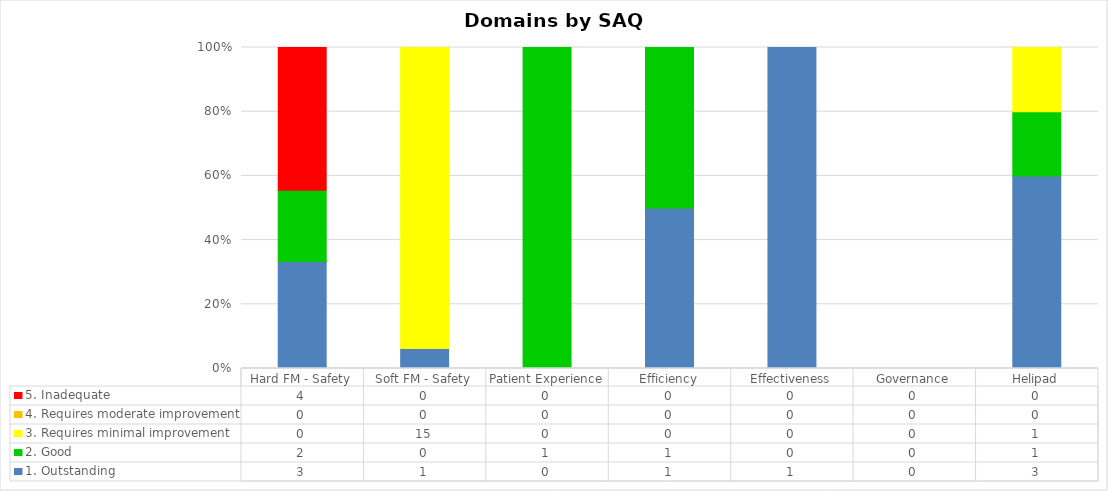
| Category | 1. Outstanding | 2. Good | 3. Requires minimal improvement | 4. Requires moderate improvement | 5. Inadequate |
|---|---|---|---|---|---|
| Hard FM - Safety | 3 | 2 | 0 | 0 | 4 |
| Soft FM - Safety | 1 | 0 | 15 | 0 | 0 |
| Patient Experience | 0 | 1 | 0 | 0 | 0 |
| Efficiency | 1 | 1 | 0 | 0 | 0 |
| Effectiveness | 1 | 0 | 0 | 0 | 0 |
| Governance | 0 | 0 | 0 | 0 | 0 |
| Helipad | 3 | 1 | 1 | 0 | 0 |